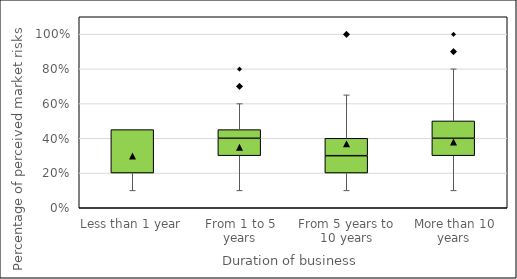
| Category | Box1 | Box2 | Box3 |
|---|---|---|---|
| Less than 1 year | 0.2 | 0.25 | 0 |
| From 1 to 5 years | 0.3 | 0.1 | 0.05 |
| From 5 years to 10 years | 0.2 | 0.1 | 0.1 |
| More than 10 years | 0.3 | 0.1 | 0.1 |